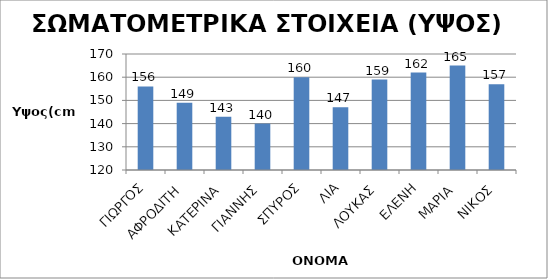
| Category | ΥΨΟΣ (cm) |
|---|---|
| ΓΙΩΡΓΟΣ | 156 |
| ΑΦΡΟΔΙΤΗ | 149 |
| ΚΑΤΕΡΙΝΑ | 143 |
| ΓΙΑΝΝΗΣ | 140 |
| ΣΠΥΡΟΣ | 160 |
| ΛΙΑ | 147 |
| ΛΟΥΚΑΣ | 159 |
| ΕΛΕΝΗ | 162 |
| ΜΑΡΙΑ | 165 |
| ΝΙΚΟΣ | 157 |